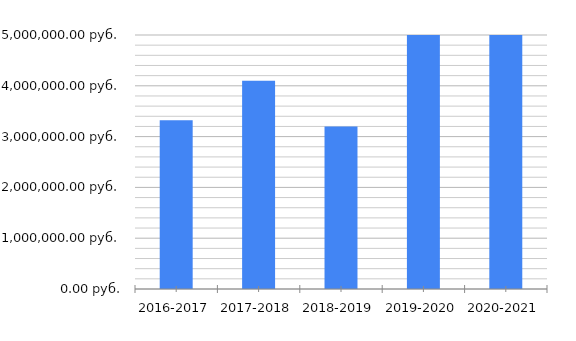
| Category | Заплатили налогов в бюджет (руб.) |
|---|---|
| 2016-2017 | 3322294 |
| 2017-2018 | 4097974 |
| 2018-2019 | 3200592 |
| 2019-2020 | 9852857 |
| 2020-2021 | 9872082 |